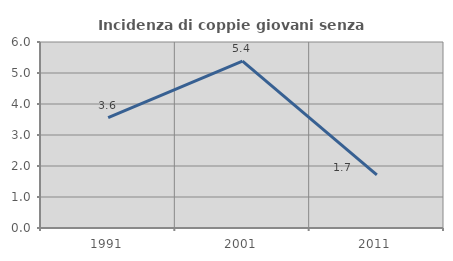
| Category | Incidenza di coppie giovani senza figli |
|---|---|
| 1991.0 | 3.559 |
| 2001.0 | 5.385 |
| 2011.0 | 1.717 |